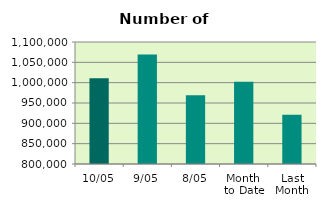
| Category | Series 0 |
|---|---|
| 10/05 | 1010646 |
| 9/05 | 1069280 |
| 8/05 | 968864 |
| Month 
to Date | 1002544 |
| Last
Month | 921109.3 |